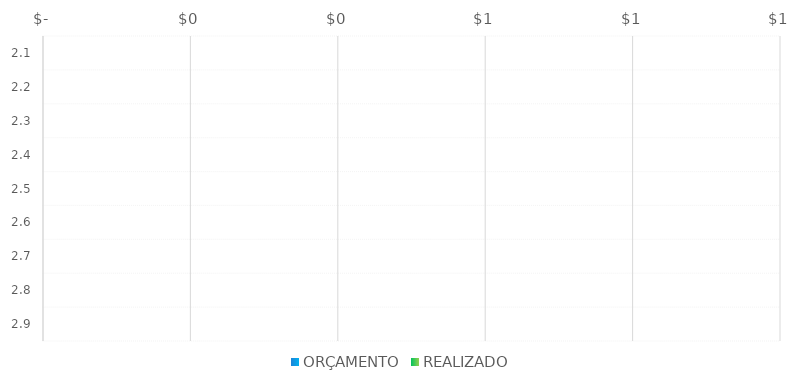
| Category | ORÇAMENTO | REALIZADO |
|---|---|---|
| 2.1 |  | 0 |
| 2.2 |  | 0 |
| 2.3 |  | 0 |
| 2.4 |  | 0 |
| 2.5 |  | 0 |
| 2.6 |  | 0 |
| 2.7 |  | 0 |
| 2.8 |  | 0 |
| 2.9 |  | 0 |